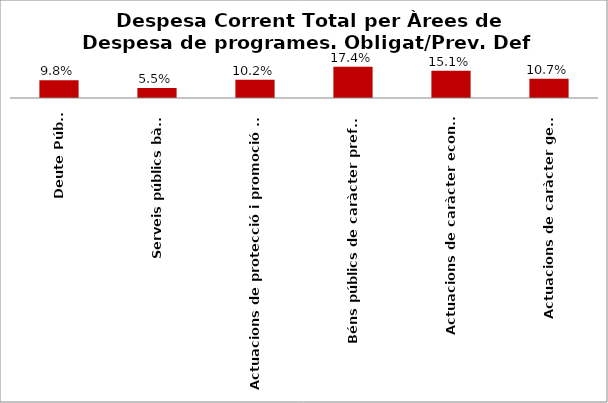
| Category | Series 0 |
|---|---|
| Deute Públic | 0.098 |
| Serveis públics bàsics | 0.055 |
| Actuacions de protecció i promoció social | 0.102 |
| Béns públics de caràcter preferent | 0.174 |
| Actuacions de caràcter econòmic | 0.151 |
| Actuacions de caràcter general | 0.107 |